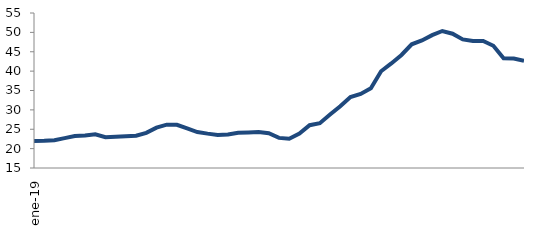
| Category | Series 0 |
|---|---|
| 2019-01-01 | 21.981 |
| 2019-02-01 | 22.02 |
| 2019-03-01 | 22.173 |
| 2019-04-01 | 22.706 |
| 2019-05-01 | 23.257 |
| 2019-06-01 | 23.383 |
| 2019-07-01 | 23.704 |
| 2019-08-01 | 22.94 |
| 2019-09-01 | 23.07 |
| 2019-10-01 | 23.182 |
| 2019-11-01 | 23.342 |
| 2019-12-01 | 24.071 |
| 2020-01-01 | 25.411 |
| 2020-02-01 | 26.191 |
| 2020-03-01 | 26.146 |
| 2020-04-01 | 25.2 |
| 2020-05-01 | 24.286 |
| 2020-06-01 | 23.873 |
| 2020-07-01 | 23.537 |
| 2020-08-01 | 23.63 |
| 2020-09-01 | 24.118 |
| 2020-10-01 | 24.168 |
| 2020-11-01 | 24.272 |
| 2020-12-01 | 23.966 |
| 2021-01-01 | 22.77 |
| 2021-02-01 | 22.543 |
| 2021-03-01 | 23.873 |
| 2021-04-01 | 26.039 |
| 2021-05-01 | 26.569 |
| 2021-06-01 | 28.789 |
| 2021-07-01 | 30.918 |
| 2021-08-01 | 33.307 |
| 2021-09-01 | 34.107 |
| 2021-10-01 | 35.571 |
| 2021-11-01 | 39.964 |
| 2021-12-01 | 41.988 |
| 2022-01-01 | 44.169 |
| 2022-02-01 | 46.93 |
| 2022-03-01 | 47.92 |
| 2022-04-01 | 49.283 |
| 2022-05-01 | 50.356 |
| 2022-06-01 | 49.66 |
| 2022-07-01 | 48.193 |
| 2022-08-01 | 47.769 |
| 2022-09-01 | 47.767 |
| 2022-10-01 | 46.541 |
| 2022-11-01 | 43.322 |
| 2022-12-01 | 43.252 |
| 2023-01-01 | 42.634 |